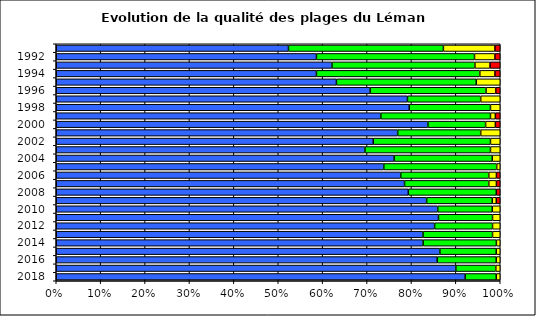
| Category | Qualité  A (en%) | Qualité  B (en%) | Qualité  C (en%) | Qualité  D (en%) |
|---|---|---|---|---|
| 2018.0 | 92.1 | 7 | 0.9 | 0 |
| 2017.0 | 90 | 9 | 1 | 0 |
| 2016.0 | 85.8 | 13.3 | 0.9 | 0 |
| 2015.0 | 86.4 | 12.7 | 0.9 | 0 |
| 2014.0 | 82.6 | 16.5 | 0.87 | 0 |
| 2013.0 | 82.609 | 15.652 | 1.739 | 0 |
| 2012.0 | 85.217 | 13.043 | 1.739 | 0 |
| 2011.0 | 86.087 | 12.174 | 1.739 | 0 |
| 2010.0 | 86 | 12.3 | 1.8 | 0 |
| 2009.0 | 83.5 | 14.8 | 0.9 | 0.9 |
| 2008.0 | 79.3 | 19.8 | 0 | 0.9 |
| 2007.0 | 78.448 | 18.966 | 1.724 | 0.862 |
| 2006.0 | 77.586 | 19.828 | 1.724 | 0.862 |
| 2005.0 | 73.7 | 25.4 | 0.8 | 0 |
| 2004.0 | 76.1 | 22.1 | 1.8 | 0 |
| 2003.0 | 69.6 | 28.3 | 2.2 | 0 |
| 2002.0 | 71.4 | 26.4 | 2.2 | 0 |
| 2001.0 | 76.9 | 18.7 | 4.4 | 0 |
| 2000.0 | 83.7 | 13 | 2.2 | 1.1 |
| 1999.0 | 73.1 | 24.7 | 1.1 | 1.1 |
| 1998.0 | 79.5 | 18.3 | 2.2 | 0 |
| 1997.0 | 79.1 | 16.5 | 4.4 | 0 |
| 1996.0 | 70.7 | 26.1 | 2.2 | 1 |
| 1995.0 | 63.1 | 31.5 | 5.4 | 0 |
| 1994.0 | 58.6 | 36.8 | 3.4 | 1.2 |
| 1993.0 | 62.1 | 32.2 | 3.4 | 2.3 |
| 1992.0 | 58.6 | 35.6 | 4.6 | 1.2 |
| 1991.0 | 52.3 | 34.9 | 11.6 | 1.2 |